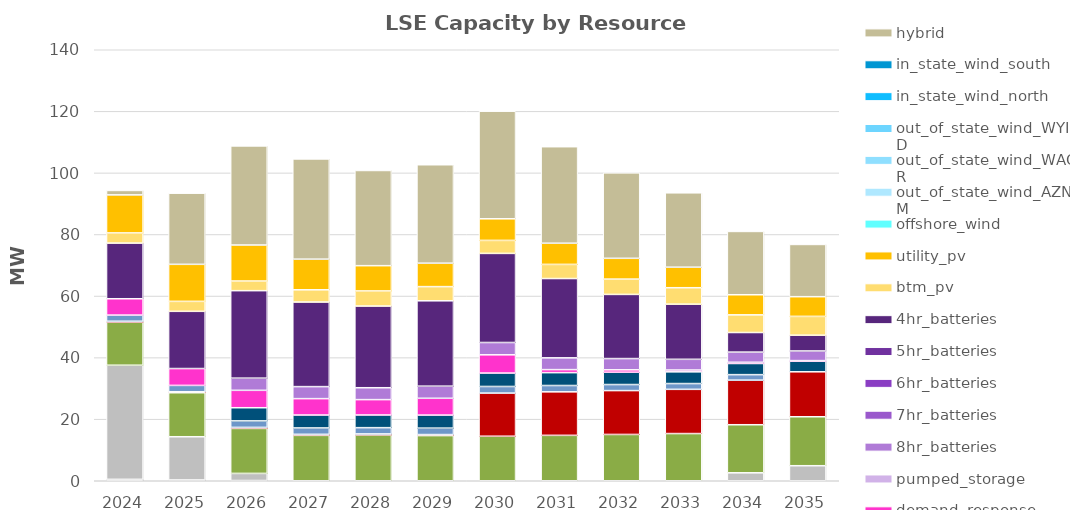
| Category | unspecified_import | steam | coal | ice | cogen | gas_ct | gas_cc | nuclear | biogas | biomass_wood | geothermal | small_hydro | hydro | demand_response | pumped_storage | 8hr_batteries | 7hr_batteries | 6hr_batteries | 5hr_batteries | 4hr_batteries | btm_pv | utility_pv | offshore_wind | out_of_state_wind_AZNM | out_of_state_wind_WAOR | out_of_state_wind_WYID | in_state_wind_north | in_state_wind_south | hybrid |
|---|---|---|---|---|---|---|---|---|---|---|---|---|---|---|---|---|---|---|---|---|---|---|---|---|---|---|---|---|---|
| 2024.0 | 0 | 0 | 0 | 0 | 0.456 | 0 | 37.071 | 0 | 0 | 13.969 | 0.313 | 2.004 | 0 | 5.306 | 0 | 0 | 0 | 0 | 0 | 18.072 | 3.305 | 12.36 | 0 | 0 | 0 | 0 | 0 | 0 | 1.441 |
| 2025.0 | 0 | 0 | 0 | 0 | 0.251 | 0 | 14.047 | 0 | 0 | 14.294 | 0.323 | 2.057 | 0 | 5.479 | 0 | 0 | 0 | 0 | 0 | 18.587 | 3.235 | 12.03 | 0 | 0 | 0 | 0 | 0 | 0 | 23.114 |
| 2026.0 | 0 | 0 | 0 | 0 | 0.076 | 0 | 2.308 | 0 | 0 | 14.618 | 0.334 | 2.109 | 4.277 | 5.651 | 0 | 3.954 | 0 | 0 | 0 | 28.416 | 3.133 | 11.701 | 0 | 0 | 0 | 0 | 0 | 0 | 32.189 |
| 2027.0 | 0 | 0 | 0 | 0 | 0 | 0 | 0 | 0 | 0 | 14.747 | 0.335 | 2.069 | 4.197 | 5.323 | 0 | 3.906 | 0 | 0 | 0 | 27.473 | 3.976 | 9.956 | 0 | 0 | 0 | 0 | 0 | 0 | 32.547 |
| 2028.0 | 0 | 0 | 0 | 0 | 0 | 0 | 0 | 0 | 0 | 14.876 | 0.337 | 2.03 | 4.117 | 4.995 | 0 | 3.859 | 0 | 0 | 0 | 26.53 | 4.908 | 8.212 | 0 | 0 | 0 | 0 | 0 | 0 | 30.922 |
| 2029.0 | 0 | 0 | 0 | 0 | 0 | 0 | 0 | 0 | 0 | 14.67 | 0.335 | 2.089 | 4.237 | 5.462 | 0 | 3.931 | 0 | 0 | 0 | 27.733 | 4.602 | 7.614 | 0 | 0 | 0 | 0 | 0 | 0 | 31.973 |
| 2030.0 | 0 | 0 | 0 | 0 | 0 | 0 | 0 | 0 | 0 | 14.464 | 14.01 | 2.149 | 4.358 | 5.929 | 0 | 4.003 | 0 | 0 | 0 | 28.936 | 4.224 | 7.017 | 0 | 0 | 0 | 0 | 0 | 0 | 34.945 |
| 2031.0 | 0 | 0 | 0 | 0 | 0 | 0 | 0 | 0 | 0 | 14.752 | 14.128 | 2.058 | 4.174 | 0.985 | 0 | 3.829 | 0 | 0 | 0 | 25.757 | 4.592 | 6.886 | 0 | 0 | 0 | 0 | 0 | 0 | 31.35 |
| 2032.0 | 0 | 0 | 0 | 0 | 0 | 0 | 0 | 0 | 0 | 15.04 | 14.246 | 1.967 | 3.99 | 0.788 | 0 | 3.654 | 0 | 0 | 0 | 20.841 | 4.973 | 6.755 | 0 | 0 | 0 | 0 | 0 | 0 | 27.754 |
| 2033.0 | 0 | 0 | 0 | 0 | 0 | 0 | 0 | 0 | 0 | 15.329 | 14.365 | 1.877 | 3.806 | 0.591 | 0 | 3.479 | 0 | 0 | 0 | 17.906 | 5.353 | 6.664 | 0 | 0 | 0 | 0 | 0 | 0 | 24.159 |
| 2034.0 | 0 | 0 | 0 | 0 | 0 | 0 | 2.579 | 0 | 0 | 15.617 | 14.483 | 1.786 | 3.622 | 0.394 | 0 | 3.305 | 0 | 0 | 0 | 6.366 | 5.736 | 6.532 | 0 | 0 | 0 | 0 | 0 | 0 | 20.564 |
| 2035.0 | 0 | 0 | 0 | 0 | 0 | 0 | 4.886 | 0 | 0 | 15.905 | 14.602 | 0 | 3.439 | 0.197 | 0 | 3.13 | 0 | 0 | 0 | 5.118 | 6.114 | 6.4 | 0 | 0 | 0 | 0 | 0 | 0 | 16.968 |